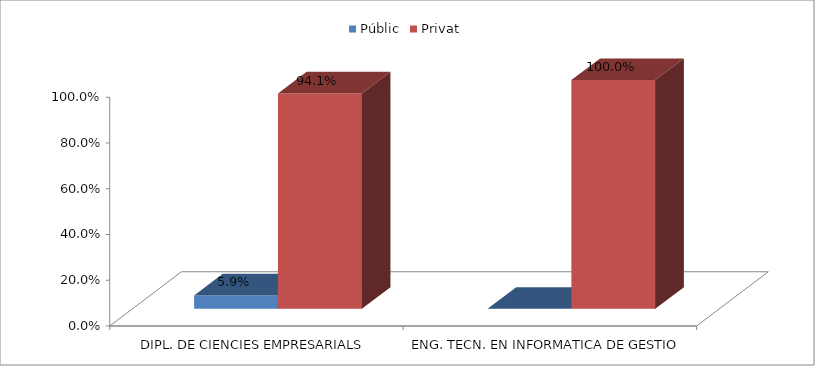
| Category | Públic | Privat |
|---|---|---|
| DIPL. DE CIENCIES EMPRESARIALS | 0.059 | 0.941 |
| ENG. TECN. EN INFORMATICA DE GESTIO | 0 | 1 |